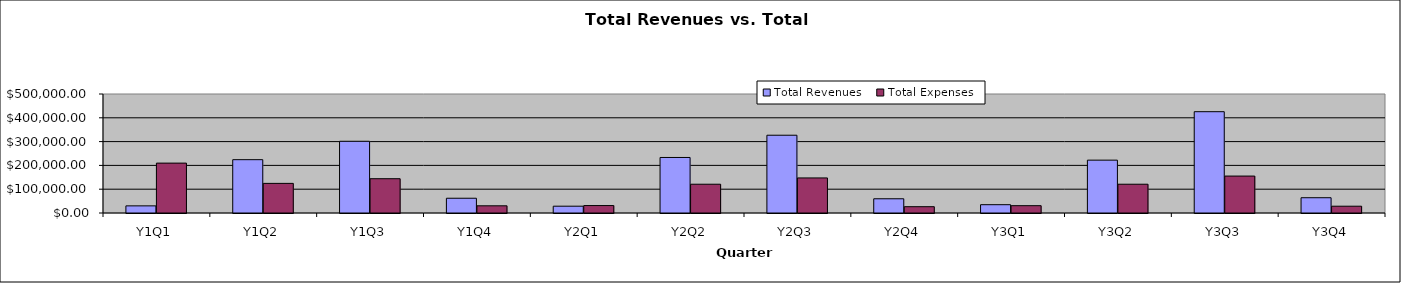
| Category | Total Revenues | Total Expenses |
|---|---|---|
| Y1Q1 | 29958.75 | 209571.956 |
| Y1Q2 | 224003.571 | 124464.2 |
| Y1Q3 | 301378.757 | 144104.076 |
| Y1Q4 | 62023.786 | 30213.785 |
| Y2Q1 | 28561.243 | 31303.293 |
| Y2Q2 | 233303.786 | 120877.483 |
| Y2Q3 | 326780.229 | 147371.339 |
| Y2Q4 | 59805.8 | 26466.048 |
| Y3Q1 | 34905.343 | 30734.051 |
| Y3Q2 | 222063.3 | 120895.696 |
| Y3Q3 | 425664 | 155161 |
| Y3Q4 | 64183.929 | 28551.18 |